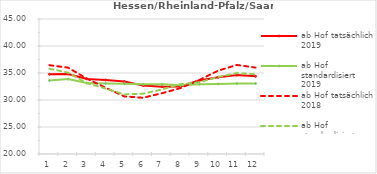
| Category | ab Hof tatsächlich 2019 | ab Hof standardisiert 2019 | ab Hof tatsächlich 2018 | ab Hof standardisiert 2018 |
|---|---|---|---|---|
| 0 | 34.764 | 33.626 | 36.441 | 35.797 |
| 1 | 34.829 | 33.883 | 35.992 | 35.068 |
| 2 | 33.905 | 33.137 | 33.957 | 33.117 |
| 3 | 33.707 | 33.073 | 32.269 | 32.126 |
| 4 | 33.413 | 33.004 | 30.667 | 31.031 |
| 5 | 32.685 | 32.925 | 30.418 | 31.177 |
| 6 | 32.464 | 32.901 | 31.248 | 31.951 |
| 7 | 32.519 | 32.739 | 32.212 | 32.932 |
| 8 | 33.596 | 32.936 | 33.72 | 33.29 |
| 9 | 34.231 | 32.984 | 35.435 | 34.259 |
| 10 | 34.635 | 33.035 | 36.492 | 34.982 |
| 11 | 34.382 | 33.054 | 36.007 | 34.77 |